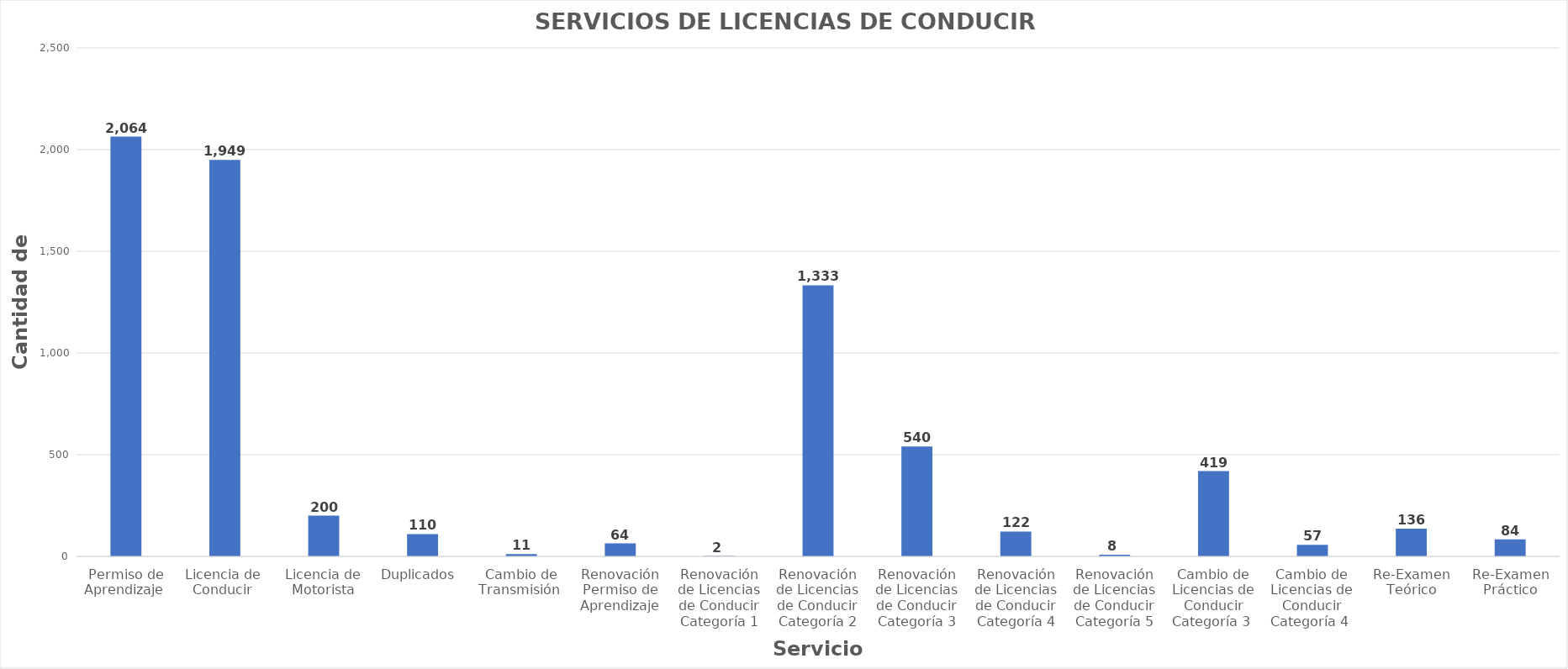
| Category | Series 0 |
|---|---|
| Permiso de Aprendizaje  | 2064 |
| Licencia de  Conducir  | 1949 |
| Licencia de Motorista | 200 |
| Duplicados  | 110 |
| Cambio de Transmisión  | 11 |
| Renovación Permiso de Aprendizaje | 64 |
| Renovación de Licencias de Conducir Categoría 1 | 2 |
| Renovación de Licencias de Conducir Categoría 2 | 1333 |
| Renovación de Licencias de Conducir Categoría 3 | 540 |
| Renovación de Licencias de Conducir Categoría 4 | 122 |
| Renovación de Licencias de Conducir Categoría 5 | 8 |
| Cambio de Licencias de Conducir Categoría 3  | 419 |
| Cambio de Licencias de Conducir Categoría 4  | 57 |
| Re-Examen Teórico | 136 |
| Re-Examen Práctico | 84 |